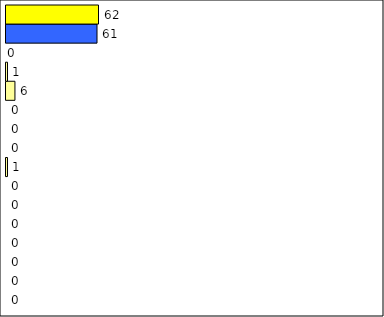
| Category | -2 | -1 | 0 | 1 | 2 | 3 | 4 | 5 | 6 | 7 | 8 | 9 | 10 | 11 | 12 | Perfect Round |
|---|---|---|---|---|---|---|---|---|---|---|---|---|---|---|---|---|
| 0 | 0 | 0 | 0 | 0 | 0 | 0 | 0 | 1 | 0 | 0 | 0 | 6 | 1 | 0 | 61 | 62 |